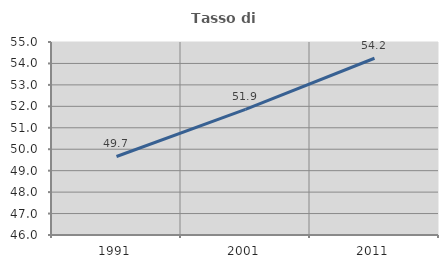
| Category | Tasso di occupazione   |
|---|---|
| 1991.0 | 49.662 |
| 2001.0 | 51.857 |
| 2011.0 | 54.242 |